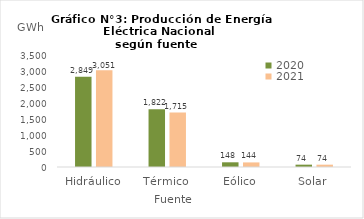
| Category | 2020 | 2021 |
|---|---|---|
| Hidráulico | 2848.971 | 3050.693 |
| Térmico | 1821.988 | 1714.878 |
| Eólico | 148.14 | 144.428 |
| Solar | 73.797 | 73.566 |